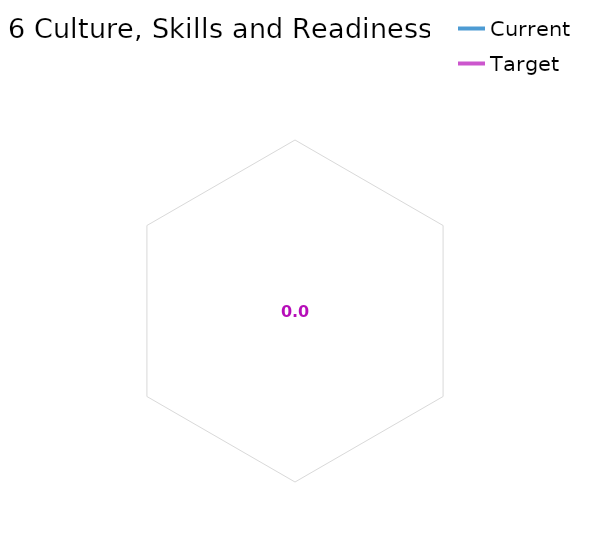
| Category | Current | Target |
|---|---|---|
| 6 Culture, Skills and Readiness average | 0 | 0 |
| 6.1 Well-developed workforce digital skills | 0 | 0 |
| 6.2 Training and culture change programme | 0 | 0 |
| 6.3 Well developed wider skills and capabilities | 0 | 0 |
| 6.4 Well developed skills of partner workforces | 0 | 0 |
| 6.5 Well developed skills of service users | 0 | 0 |